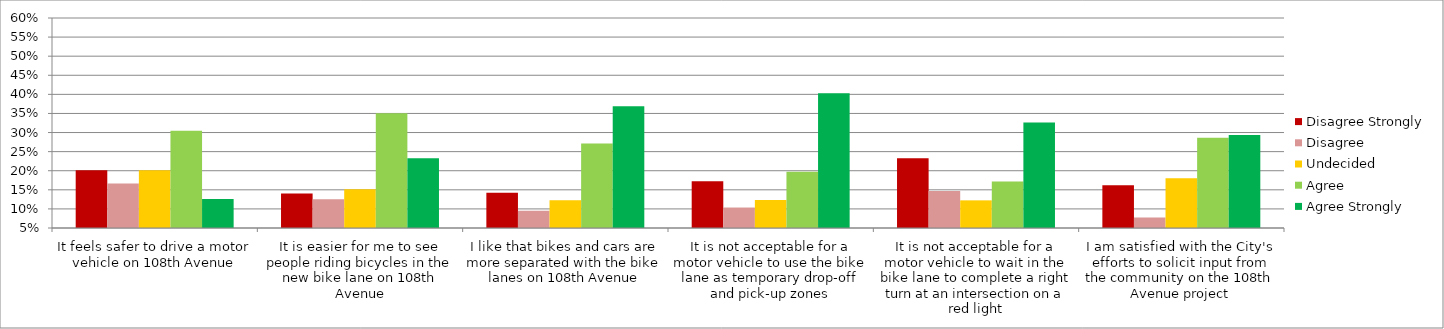
| Category | Disagree Strongly | Disagree | Undecided | Agree | Agree Strongly |
|---|---|---|---|---|---|
| It feels safer to drive a motor vehicle on 108th Avenue | 0.201 | 0.167 | 0.201 | 0.305 | 0.126 |
| It is easier for me to see people riding bicycles in the new bike lane on 108th Avenue | 0.14 | 0.126 | 0.151 | 0.351 | 0.232 |
| I like that bikes and cars are more separated with the bike lanes on 108th Avenue | 0.142 | 0.095 | 0.122 | 0.271 | 0.369 |
| It is not acceptable for a motor vehicle to use the bike lane as temporary drop-off and pick-up zones | 0.173 | 0.104 | 0.123 | 0.197 | 0.403 |
| It is not acceptable for a motor vehicle to wait in the bike lane to complete a right turn at an intersection on a red light | 0.232 | 0.147 | 0.122 | 0.172 | 0.326 |
| I am satisfied with the City's efforts to solicit input from the community on the 108th Avenue project | 0.162 | 0.078 | 0.18 | 0.286 | 0.294 |